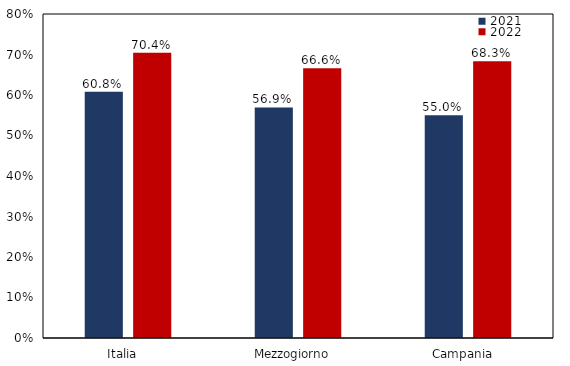
| Category | 2021 | 2022 |
|---|---|---|
| Italia   | 0.608 | 0.704 |
| Mezzogiorno   | 0.569 | 0.666 |
| Campania   | 0.55 | 0.683 |